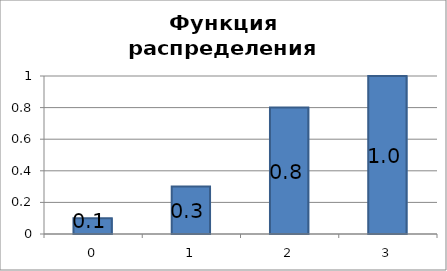
| Category | Series 0 |
|---|---|
| 0.0 | 0.1 |
| 1.0 | 0.3 |
| 2.0 | 0.8 |
| 3.0 | 1 |